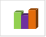
| Category | област |
|---|---|
| летен сезон 2019  | 29399 |
| летен сезон 2021  | 24383 |
| летен сезон 2022 г.  | 33406 |